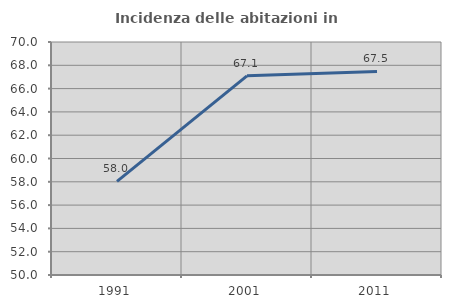
| Category | Incidenza delle abitazioni in proprietà  |
|---|---|
| 1991.0 | 58.039 |
| 2001.0 | 67.1 |
| 2011.0 | 67.476 |